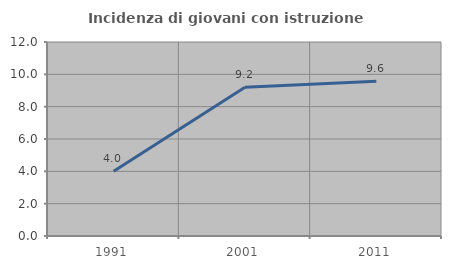
| Category | Incidenza di giovani con istruzione universitaria |
|---|---|
| 1991.0 | 4 |
| 2001.0 | 9.195 |
| 2011.0 | 9.574 |